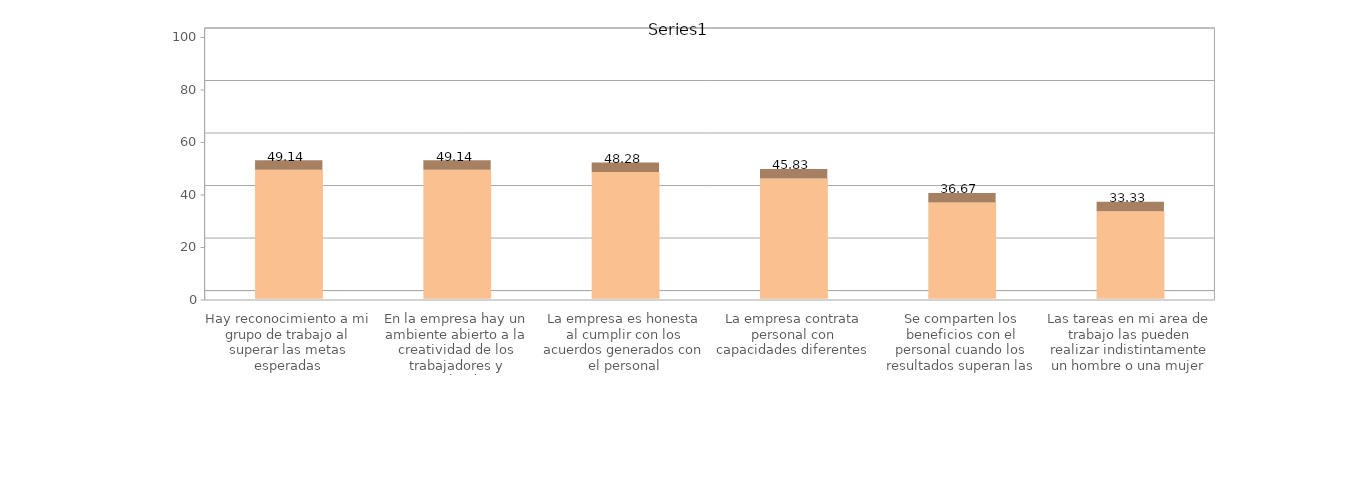
| Category | Series1 |
|---|---|
| Hay reconocimiento a mi grupo de trabajo al superar las metas esperadas | 49.138 |
| En la empresa hay un ambiente abierto a la creatividad de los trabajadores y empleados | 49.138 |
| La empresa es honesta al cumplir con los acuerdos generados con el personal | 48.276 |
| La empresa contrata personal con capacidades diferentes | 45.833 |
| Se comparten los beneficios con el personal cuando los resultados superan las metas | 36.667 |
| Las tareas en mi area de trabajo las pueden realizar indistintamente un hombre o una mujer | 33.333 |